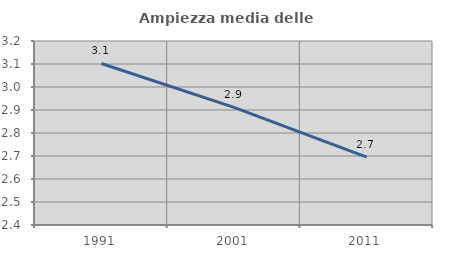
| Category | Ampiezza media delle famiglie |
|---|---|
| 1991.0 | 3.102 |
| 2001.0 | 2.911 |
| 2011.0 | 2.695 |